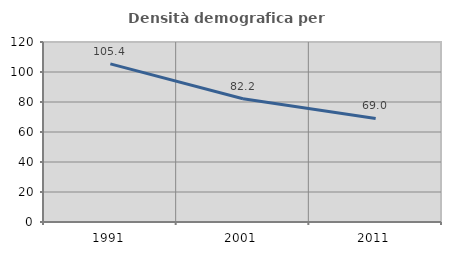
| Category | Densità demografica |
|---|---|
| 1991.0 | 105.405 |
| 2001.0 | 82.214 |
| 2011.0 | 69.012 |